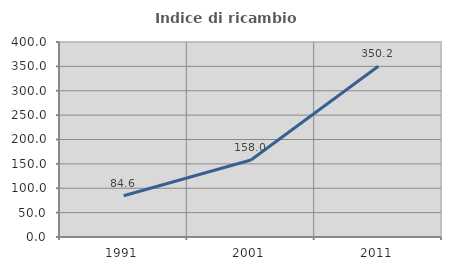
| Category | Indice di ricambio occupazionale  |
|---|---|
| 1991.0 | 84.586 |
| 2001.0 | 158.048 |
| 2011.0 | 350.223 |